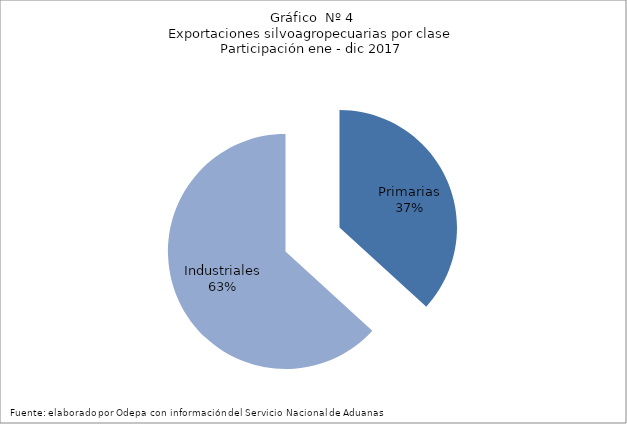
| Category | Series 0 |
|---|---|
| Primarias | 5771339 |
| Industriales | 9925456 |